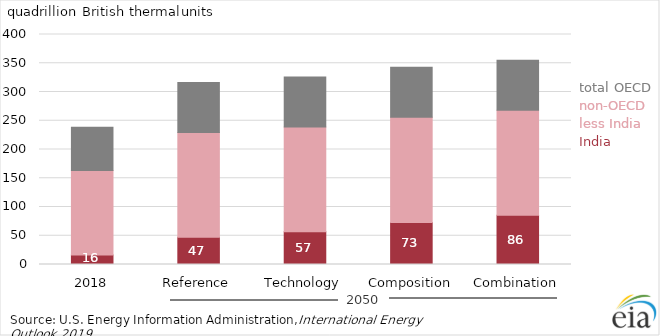
| Category | India | Non-OECD less India | Total OECD |
|---|---|---|---|
| 2018 | 16.336 | 147.064 | 75.423 |
| Reference | 47.336 | 182.233 | 87.088 |
| Technology | 56.86 | 182.172 | 87.002 |
| Composition | 73.193 | 182.777 | 86.91 |
| Combination | 85.682 | 182.729 | 86.967 |